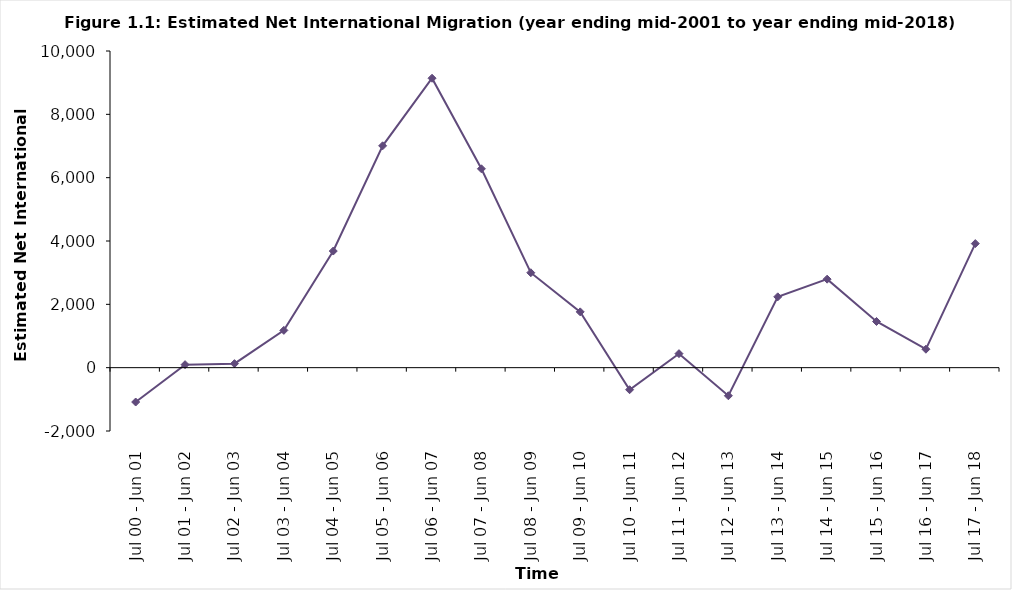
| Category | Net International Migration |
|---|---|
| Jul 00 - Jun 01 | -1085 |
| Jul 01 - Jun 02 | 95 |
| Jul 02 - Jun 03 | 127 |
| Jul 03 - Jun 04 | 1178 |
| Jul 04 - Jun 05 | 3683 |
| Jul 05 - Jun 06 | 7006 |
| Jul 06 - Jun 07 | 9140 |
| Jul 07 - Jun 08 | 6280 |
| Jul 08 - Jun 09 | 2998 |
| Jul 09 - Jun 10 | 1762 |
| Jul 10 - Jun 11 | -696 |
| Jul 11 - Jun 12 | 442 |
| Jul 12 - Jun 13 | -887 |
| Jul 13 - Jun 14 | 2237 |
| Jul 14 - Jun 15 | 2795 |
| Jul 15 - Jun 16 | 1458 |
| Jul 16 - Jun 17 | 583 |
| Jul 17 - Jun 18 | 3918 |